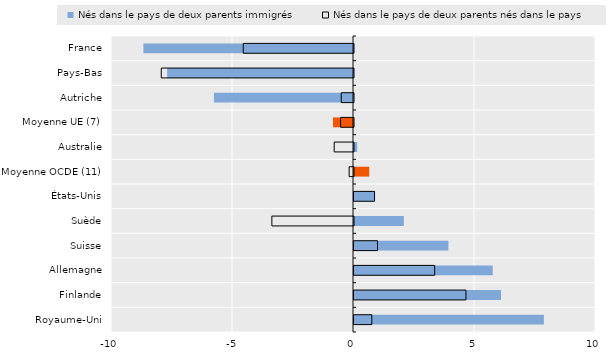
| Category | Nés dans le pays de deux parents immigrés | Nés dans le pays de deux parents nés dans le pays |
|---|---|---|
| France | -8.66 | -4.556 |
| Pays-Bas | -7.68 | -7.944 |
| Autriche | -5.746 | -0.507 |
| Moyenne UE (7) | -0.827 | -0.533 |
| Australie | 0.132 | -0.797 |
| Moyenne OCDE (11) | 0.63 | -0.18 |
| États-Unis | 0.831 | 0.849 |
| Suède | 2.059 | -3.373 |
| Suisse | 3.902 | 0.97 |
| Allemagne | 5.732 | 3.334 |
| Finlande | 6.076 | 4.626 |
| Royaume-Uni | 7.847 | 0.736 |